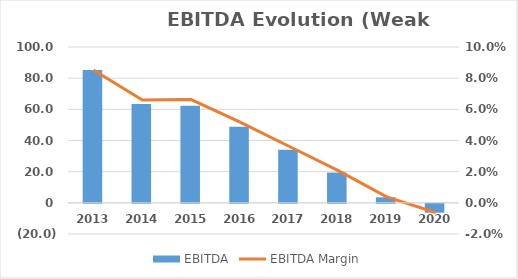
| Category | EBITDA |
|---|---|
| 2013.0 | 85.247 |
| 2014.0 | 63.376 |
| 2015.0 | 62.274 |
| 2016.0 | 48.762 |
| 2017.0 | 34.035 |
| 2018.0 | 19.414 |
| 2019.0 | 3.546 |
| 2020.0 | -5.7 |